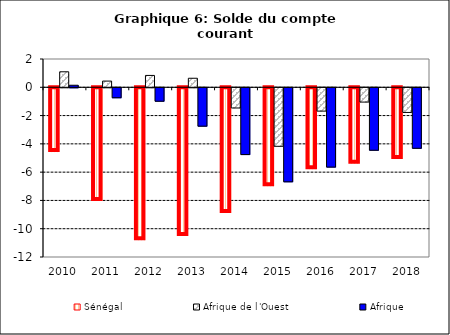
| Category | Sénégal | Afrique de l'Ouest | Afrique |
|---|---|---|---|
| 2010.0 | -4.514 | 1.095 | 0.144 |
| 2011.0 | -7.977 | 0.439 | -0.706 |
| 2012.0 | -10.749 | 0.839 | -0.95 |
| 2013.0 | -10.436 | 0.638 | -2.715 |
| 2014.0 | -8.815 | -1.429 | -4.722 |
| 2015.0 | -6.925 | -4.138 | -6.65 |
| 2016.0 | -5.72 | -1.65 | -5.608 |
| 2017.0 | -5.339 | -1.011 | -4.418 |
| 2018.0 | -5.001 | -1.744 | -4.278 |